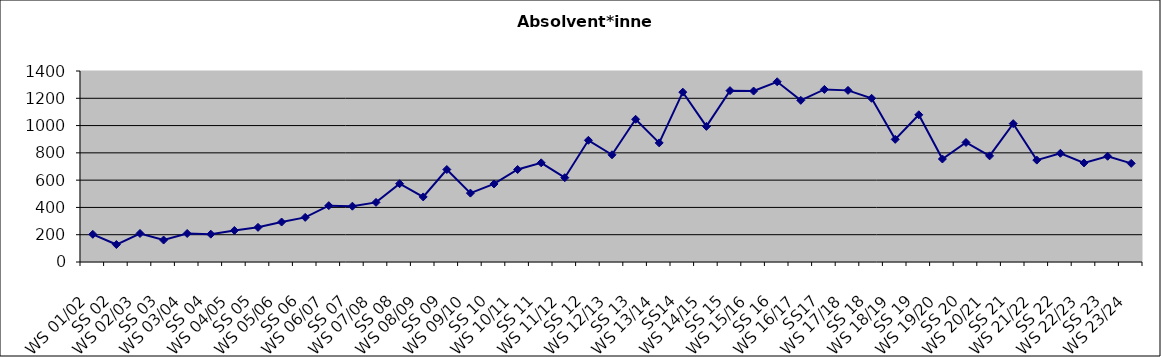
| Category | Absolvent*innen |
|---|---|
| WS 01/02 | 203 |
| SS 02 | 128 |
| WS 02/03 | 209 |
| SS 03 | 161 |
| WS 03/04 | 209 |
| SS 04 | 204 |
| WS 04/05 | 231 |
| SS 05 | 254 |
| WS 05/06 | 293 |
| SS 06 | 327 |
| WS 06/07 | 413 |
| SS 07 | 409 |
| WS 07/08 | 437 |
| SS 08 | 574 |
| WS 08/09 | 477 |
| SS 09 | 678 |
| WS 09/10 | 505 |
| SS 10 | 572 |
| WS 10/11 | 678 |
| SS 11 | 727 |
| WS 11/12 | 618 |
| SS 12 | 892 |
| WS 12/13 | 786 |
| SS 13 | 1046 |
| WS 13/14 | 873 |
| SS14 | 1245 |
| WS 14/15 | 994 |
| SS 15 | 1256 |
| WS 15/16 | 1253 |
| SS 16 | 1321 |
| WS 16/17 | 1185 |
| SS17 | 1265 |
| WS 17/18 | 1258 |
| SS 18 | 1200 |
| WS 18/19 | 899 |
| SS 19 | 1079 |
| WS 19/20 | 755 |
| SS 20 | 876 |
| WS 20/21 | 778 |
| SS 21 | 1014 |
| WS 21/22 | 747 |
| SS 22 | 797 |
| WS 22/23 | 726 |
| SS 23 | 775 |
| WS 23/24 | 723 |